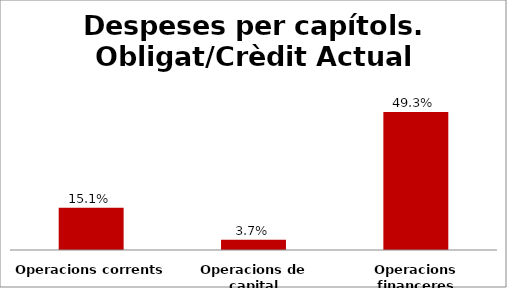
| Category | Series 0 |
|---|---|
| Operacions corrents | 0.151 |
| Operacions de capital | 0.037 |
| Operacions financeres | 0.493 |